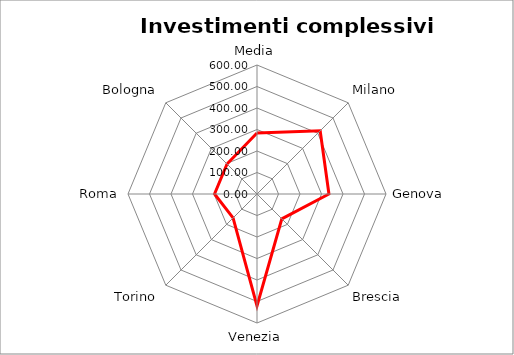
| Category | Investimenti complessivi procapite |
|---|---|
| Media | 283.719 |
| Milano | 415.53 |
| Genova | 334.59 |
| Brescia | 163.25 |
| Venezia | 520.51 |
| Torino | 157.42 |
| Roma | 197.54 |
| Bologna | 197.19 |